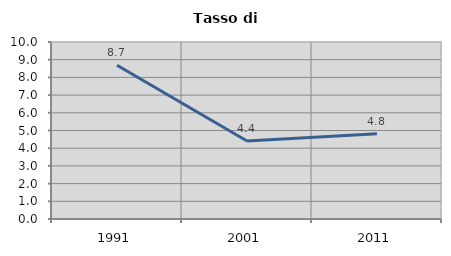
| Category | Tasso di disoccupazione   |
|---|---|
| 1991.0 | 8.684 |
| 2001.0 | 4.406 |
| 2011.0 | 4.822 |